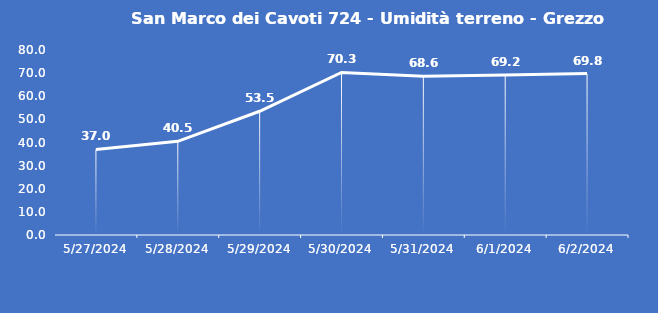
| Category | San Marco dei Cavoti 724 - Umidità terreno - Grezzo (%VWC) |
|---|---|
| 5/27/24 | 37 |
| 5/28/24 | 40.5 |
| 5/29/24 | 53.5 |
| 5/30/24 | 70.3 |
| 5/31/24 | 68.6 |
| 6/1/24 | 69.2 |
| 6/2/24 | 69.8 |